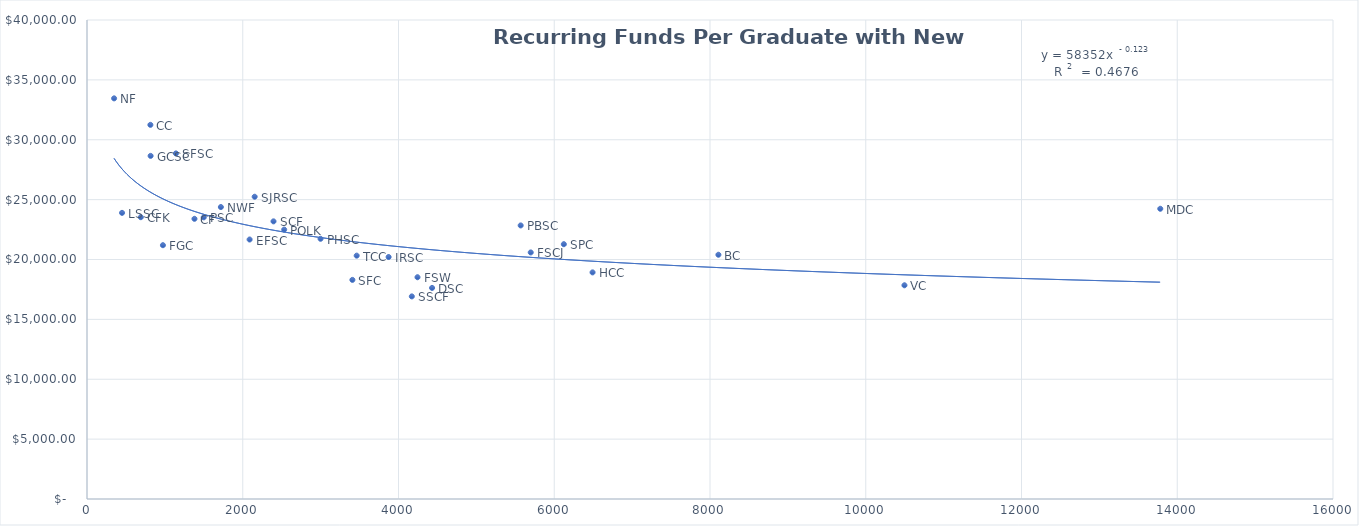
| Category | Per Graduate Funds w/Distribution |
|---|---|
| 348.0 | 33456.385 |
| 691.0 | 23533.729 |
| 814.0 | 31244.383 |
| 975.0 | 21193.35 |
| 1142.0 | 28857.735 |
| 450.0 | 23893.677 |
| 817.0 | 28652.364 |
| 1719.0 | 24378.971 |
| 1380.0 | 23398.194 |
| 2153.0 | 25240.43 |
| 2532.0 | 22494.761 |
| 2395.0 | 23185.292 |
| 1499.0 | 23521.318 |
| 2999.0 | 21729.155 |
| 2088.0 | 21668.998 |
| 3463.0 | 20321.117 |
| 4244.0 | 18518.531 |
| 4431.0 | 17625.468 |
| 3408.0 | 18296.895 |
| 3873.0 | 20206.466 |
| 4171.0 | 16918.755 |
| 5698.0 | 20589.206 |
| 6123.0 | 21277.01 |
| 5569.0 | 22844.407 |
| 6492.0 | 18923.196 |
| 8108.0 | 20396.159 |
| 10497.0 | 17846.426 |
| 13782.0 | 24236.04 |